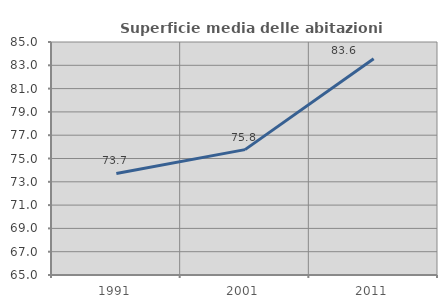
| Category | Superficie media delle abitazioni occupate |
|---|---|
| 1991.0 | 73.721 |
| 2001.0 | 75.76 |
| 2011.0 | 83.565 |